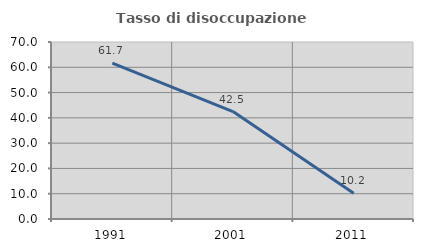
| Category | Tasso di disoccupazione giovanile  |
|---|---|
| 1991.0 | 61.654 |
| 2001.0 | 42.5 |
| 2011.0 | 10.169 |